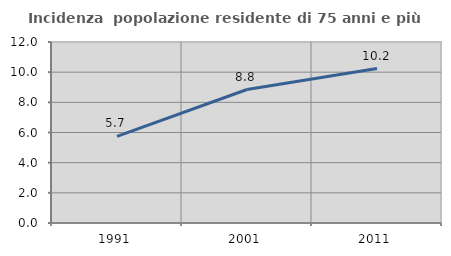
| Category | Incidenza  popolazione residente di 75 anni e più |
|---|---|
| 1991.0 | 5.739 |
| 2001.0 | 8.849 |
| 2011.0 | 10.24 |